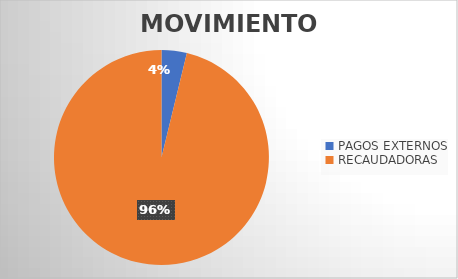
| Category | MOVIMIENTOS |
|---|---|
| PAGOS EXTERNOS | 726 |
| RECAUDADORAS | 18382 |